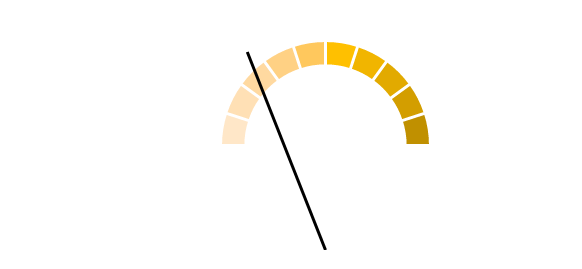
| Category | Meta |
|---|---|
| 0 | 0.05 |
| 1 | 0.05 |
| 2 | 0.05 |
| 3 | 0.05 |
| 4 | 0.05 |
| 5 | 0.05 |
| 6 | 0.05 |
| 7 | 0.05 |
| 8 | 0.05 |
| 9 | 0.05 |
| 10 | 0.5 |